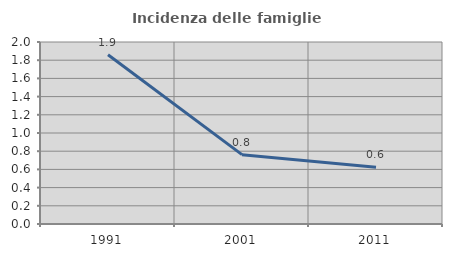
| Category | Incidenza delle famiglie numerose |
|---|---|
| 1991.0 | 1.859 |
| 2001.0 | 0.762 |
| 2011.0 | 0.624 |